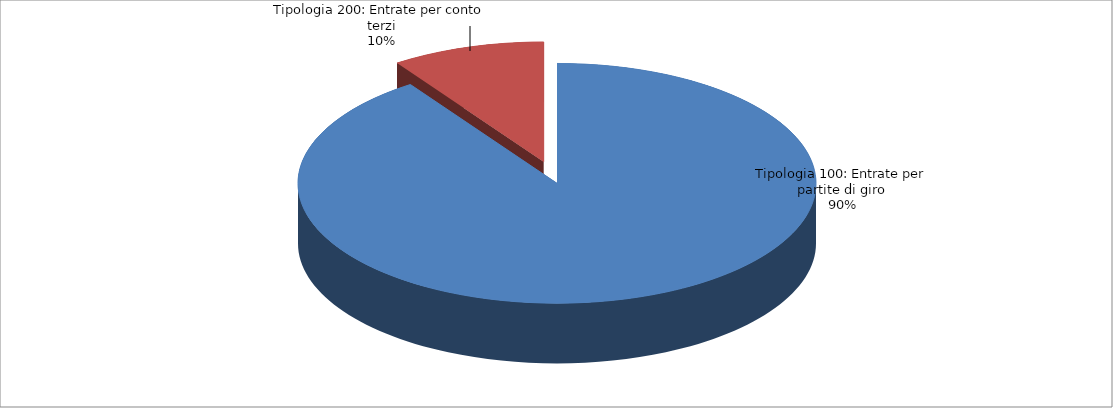
| Category | Series 0 |
|---|---|
| Tipologia 100: Entrate per partite di giro | 5361000 |
| Tipologia 200: Entrate per conto terzi | 568000 |